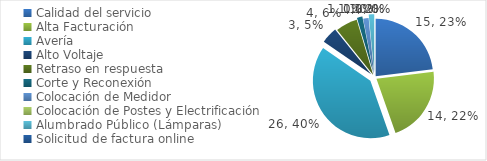
| Category | Series 0 |
|---|---|
| Calidad del servicio | 15 |
| Alta Facturación | 14 |
| Avería | 26 |
| Alto Voltaje | 3 |
| Retraso en respuesta | 4 |
| Corte y Reconexión  | 1 |
| Colocación de Medidor | 1 |
| Colocación de Postes y Electrificación  | 0 |
| Alumbrado Público (Lámparas) | 1 |
| Solicitud de factura online | 0 |